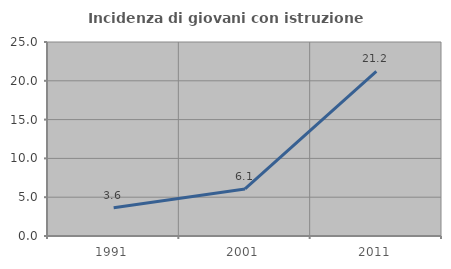
| Category | Incidenza di giovani con istruzione universitaria |
|---|---|
| 1991.0 | 3.644 |
| 2001.0 | 6.061 |
| 2011.0 | 21.229 |